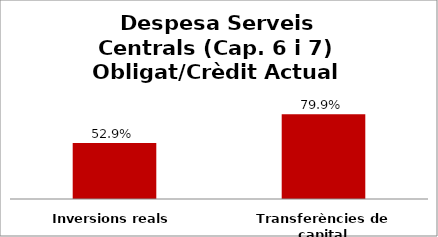
| Category | Series 0 |
|---|---|
| Inversions reals | 0.529 |
| Transferències de capital | 0.799 |